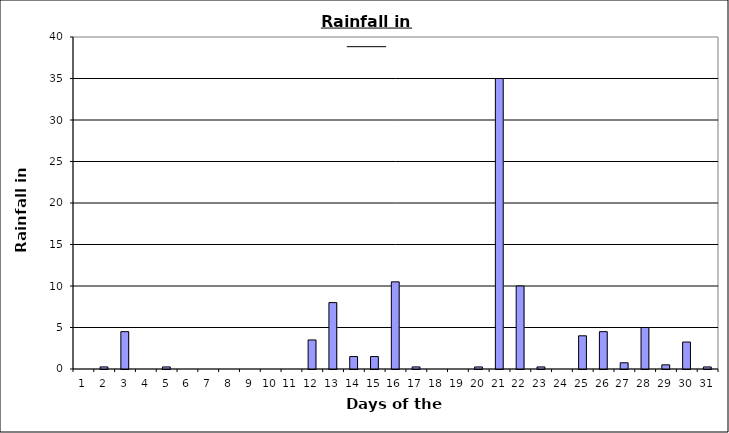
| Category | Series 0 |
|---|---|
| 0 | 0 |
| 1 | 0.25 |
| 2 | 4.5 |
| 3 | 0 |
| 4 | 0.25 |
| 5 | 0 |
| 6 | 0 |
| 7 | 0 |
| 8 | 0 |
| 9 | 0 |
| 10 | 0 |
| 11 | 3.5 |
| 12 | 8 |
| 13 | 1.5 |
| 14 | 1.5 |
| 15 | 10.5 |
| 16 | 0.25 |
| 17 | 0 |
| 18 | 0 |
| 19 | 0.25 |
| 20 | 35 |
| 21 | 10 |
| 22 | 0.25 |
| 23 | 0 |
| 24 | 4 |
| 25 | 4.5 |
| 26 | 0.75 |
| 27 | 5 |
| 28 | 0.5 |
| 29 | 3.25 |
| 30 | 0.25 |